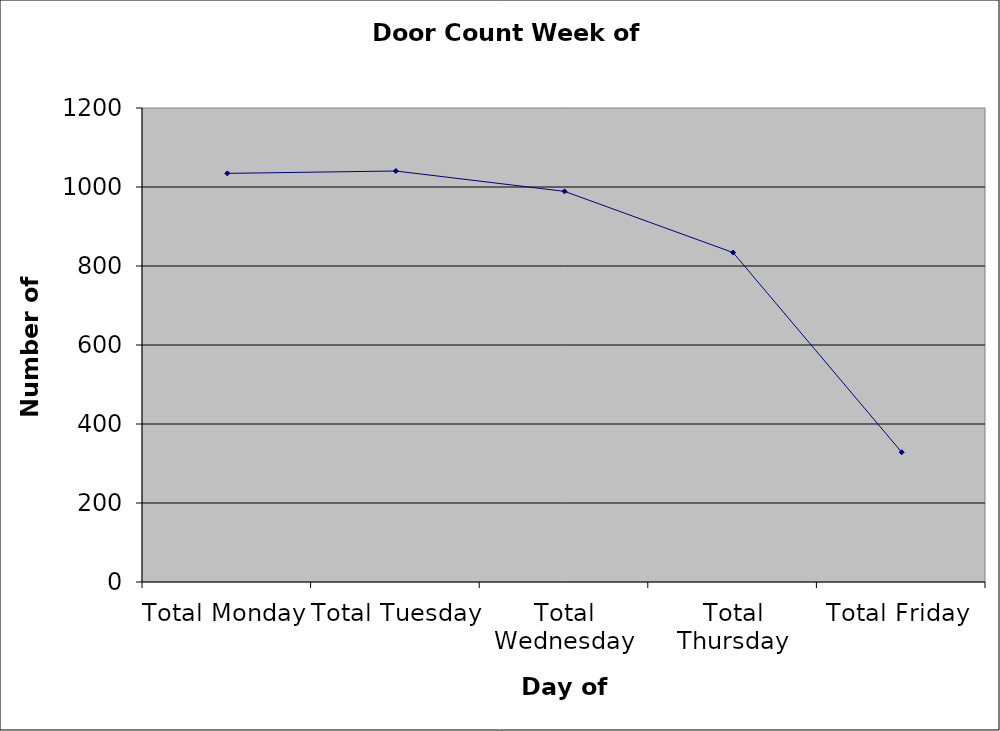
| Category | Series 0 |
|---|---|
| Total Monday | 1034.5 |
| Total Tuesday | 1040.5 |
| Total Wednesday | 989 |
| Total Thursday | 834 |
| Total Friday | 328.5 |